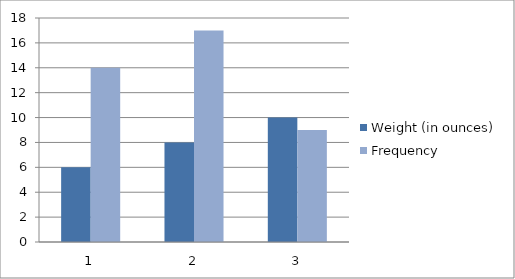
| Category | Weight (in ounces) | Frequency |
|---|---|---|
| 0 | 6 | 14 |
| 1 | 8 | 17 |
| 2 | 10 | 9 |